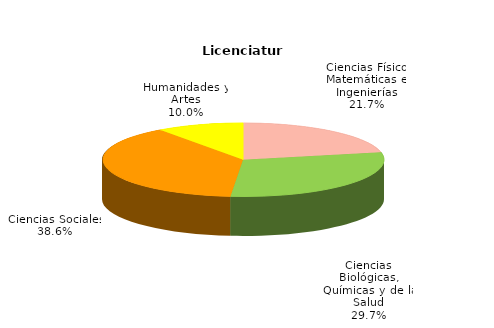
| Category | Series 0 |
|---|---|
| Ciencias Físico Matemáticas e Ingenierías | 49704 |
| Ciencias Biológicas, Químicas y de la Salud | 68164 |
| Ciencias Sociales | 88563 |
| Humanidades y Artes | 22837 |